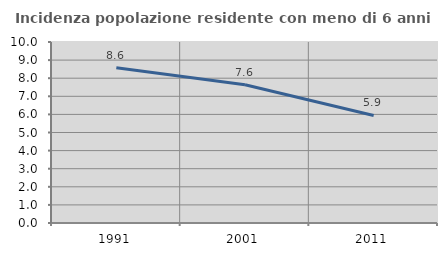
| Category | Incidenza popolazione residente con meno di 6 anni |
|---|---|
| 1991.0 | 8.578 |
| 2001.0 | 7.635 |
| 2011.0 | 5.941 |